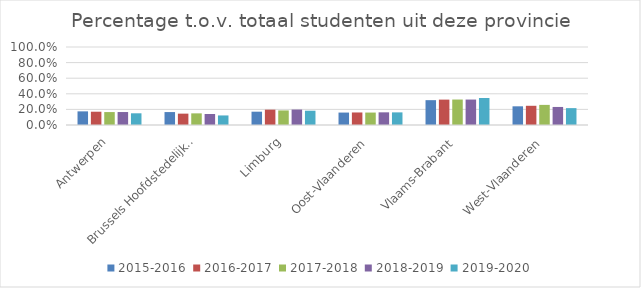
| Category | 2015-2016 | 2016-2017 | 2017-2018 | 2018-2019 | 2019-2020 |
|---|---|---|---|---|---|
| Antwerpen | 0.175 | 0.17 | 0.166 | 0.166 | 0.15 |
| Brussels Hoofdstedelijk Gewest | 0.166 | 0.146 | 0.149 | 0.141 | 0.123 |
| Limburg | 0.171 | 0.197 | 0.187 | 0.198 | 0.183 |
| Oost-Vlaanderen | 0.159 | 0.161 | 0.16 | 0.162 | 0.162 |
| Vlaams-Brabant | 0.319 | 0.325 | 0.326 | 0.326 | 0.346 |
| West-Vlaanderen | 0.24 | 0.246 | 0.258 | 0.231 | 0.216 |